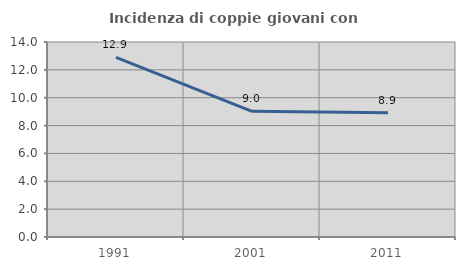
| Category | Incidenza di coppie giovani con figli |
|---|---|
| 1991.0 | 12.9 |
| 2001.0 | 9.022 |
| 2011.0 | 8.915 |